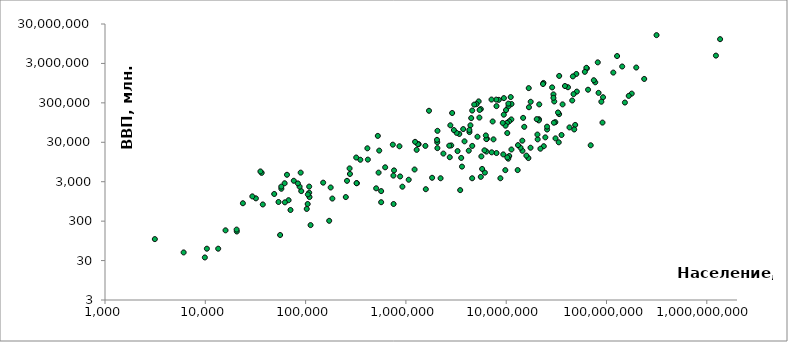
| Category | ВВП, млн. долл. |
|---|---|
| 1356990000.0 | 12380000 |
| 1232828000.0 | 4735000 |
| 315370000.0 | 15660000 |
| 237641326.0 | 1212000 |
| 197986000.0 | 2362000 |
| 178352000.0 | 514600 |
| 166629383.0 | 450500 |
| 152518015.0 | 305500 |
| 143369806.0 | 2509000 |
| 127487000.0 | 4617000 |
| 116901761.0 | 1758000 |
| 92337852.0 | 416700 |
| 91195675.0 | 94760 |
| 88840000.0 | 320500 |
| 83344000.0 | 537800 |
| 81843743.0 | 3194000 |
| 77242003.0 | 997400 |
| 74724269.0 | 1125000 |
| 69575394.0 | 25190 |
| 65479453.00000001 | 646100 |
| 63704091.0 | 2253000 |
| 62989551.0 | 2323000 |
| 60820696.0 | 1834000 |
| 50586757.0 | 578600 |
| 50004441.0 | 1622000 |
| 48724387.0 | 82720 |
| 47656367.0 | 63440 |
| 46963000.0 | 500000 |
| 46196276.0 | 1407000 |
| 45539121.0 | 344700 |
| 42749418.0 | 71500 |
| 41281631.0 | 746900 |
| 38538447.0 | 802000 |
| 36485828.0 | 274500 |
| 35620977.0 | 45900 |
| 33703068.0 | 155400 |
| 33749000.0 | 1446000 |
| 33397058.0 | 29990 |
| 32844000.0 | 171000 |
| 31011137.0 | 37740 |
| 30894000.0 | 97210 |
| 30135875.0 | 325400 |
| 29874600.0 | 94040 |
| 29577175.0 | 492000 |
| 29573000.0 | 402100 |
| 28705133.0 | 740500 |
| 25569263.0 | 63240 |
| 25545939.0 | 74770 |
| 24553672.0 | 40000 |
| 23700715.0 | 23870 |
| 23521000.0 | 960700 |
| 23282670.0 | 901900 |
| 21928518.0 | 20600 |
| 21355849.0 | 274100 |
| 21223550.0 | 115100 |
| 21117690.0 | 107600 |
| 20594615.0 | 35600 |
| 20468943.0 | 47120 |
| 20162517.0 | 115900 |
| 17546000.0 | 319400 |
| 17481984.0 | 21830 |
| 16856000.0 | 232300 |
| 16774750.000000002 | 709500 |
| 16644338.999999998 | 11930 |
| 15882815.0 | 13770 |
| 15137569.0 | 73950 |
| 14747000.0 | 124800 |
| 14517176.0 | 18260 |
| 14478320.0 | 32950 |
| 13883577.0 | 21930 |
| 13107945.0 | 25400 |
| 13013678.0 | 5916 |
| 11290067.0 | 280800 |
| 11274106.0 | 19690 |
| 11249266.0 | 114100 |
| 11094850.0 | 420600 |
| 10718379.0 | 13460 |
| 10673800.0 | 101700 |
| 10541840.0 | 245000 |
| 10505445.0 | 286700 |
| 10480710.0 | 11530 |
| 10255644.0 | 12440 |
| 10248042.0 | 51410 |
| 10183339.0 | 93230 |
| 9957731.0 | 196800 |
| 9846582.0 | 79090 |
| 9797445.0 | 5896 |
| 9482855.0 | 395800 |
| 9462400.0 | 150300 |
| 9351838.0 | 14790 |
| 9235100.0 | 93020 |
| 8749387.0 | 3672 |
| 8443018.0 | 357800 |
| 8000000.0 | 247900 |
| 8000000.0 | 16010 |
| 7954662.0 | 362400 |
| 7466000.0 | 35600 |
| 7327224.0 | 101200 |
| 7170112.0 | 16700 |
| 7136300.0 | 363700 |
| 6415100.0 | 36820 |
| 6348800.0 | 17440 |
| 6337127.0 | 36210 |
| 6264129.0 | 44780 |
| 6126450.0 | 5100 |
| 6071045.0 | 18770 |
| 5753324.0 | 6324 |
| 5654800.0 | 13160 |
| 5580862.0 | 3978 |
| 5580516.0 | 208500 |
| 5430800.0 | 198100 |
| 5404322.0 | 126900 |
| 5312400.0 | 326700 |
| 5169660.0 | 41510 |
| 5060500.0 | 278100 |
| 4800250.0 | 271200 |
| 4585000.0 | 24280 |
| 4582769.0 | 191500 |
| 4575586.0 | 3672 |
| 4478100.0 | 123300 |
| 4398150.0 | 80890 |
| 4301712.0 | 54470 |
| 4291719.0 | 61610 |
| 4233063.0 | 18360 |
| 3839737.0 | 31720 |
| 3725789.0 | 64840 |
| 3622961.0 | 7242 |
| 3559500.0 | 12040 |
| 3476608.0 | 1836 |
| 3405813.0 | 48760 |
| 3274300.0 | 17950 |
| 3203792.0 | 52020 |
| 3007758.0 | 61300 |
| 2891553.0 | 165900 |
| 2831741.0 | 24990 |
| 2773479.0 | 80890 |
| 2736800.0 | 12550 |
| 2705800.0 | 24580 |
| 2364433.0 | 15500 |
| 2216850.0 | 3672 |
| 2063840.0 | 58560 |
| 2059794.0000000002 | 21320 |
| 2053237.0000000002 | 30090 |
| 2041763.0 | 34580 |
| 1824777.0 | 3774 |
| 1699435.0 | 189000 |
| 1579632.0 | 1938 |
| 1563873.0 | 24280 |
| 1339662.0 | 26930 |
| 1317714.0 | 26830 |
| 1280294.0 | 19280 |
| 1234571.0 | 30800 |
| 1220408.0 | 6120 |
| 1066409.0 | 3366 |
| 922708.0 | 2244 |
| 875822.0 | 4080 |
| 862011.0 | 23770 |
| 761510.0 | 5814 |
| 753943.0 | 816 |
| 750443.0 | 4284 |
| 740471.0 | 26110 |
| 621240.0 | 6957 |
| 566613.0 | 906.5 |
| 566481.0 | 1734 |
| 542200.0 | 18470 |
| 534175.0 | 5100 |
| 524853.0 | 43550 |
| 505335.0 | 2040 |
| 417520.0 | 10910 |
| 412892.0 | 21110 |
| 351275.0 | 10810 |
| 324313.0 | 2754 |
| 322100.0 | 2754 |
| 319575.0 | 12330 |
| 276731.0 | 4718 |
| 274530.0 | 6528 |
| 258735.0 | 3158 |
| 251674.0 | 1224 |
| 184772.0 | 1122 |
| 177794.0 | 2142 |
| 171878.0 | 306 |
| 149679.0 | 2838 |
| 112098.0 | 238.1 |
| 109367.0 | 1224 |
| 108590.0 | 1577 |
| 108587.0 | 2258 |
| 105303.0 | 1428 |
| 104891.0 | 816 |
| 102660.0 | 612 |
| 90510.0 | 1734 |
| 89300.0 | 5100 |
| 87169.0 | 2244 |
| 83739.0 | 2719 |
| 76246.0 | 3169 |
| 70680.0 | 575.3 |
| 67665.0 | 1020 |
| 65208.0 | 4500 |
| 62152.0 | 900 |
| 61811.0 | 2742 |
| 57300.0 | 1989 |
| 57223.0 | 2250 |
| 55717.0 | 133.5 |
| 53697.0 | 918 |
| 48660.0 | 1465 |
| 37429.0 | 794.7 |
| 36475.0 | 5028 |
| 35444.0 | 5470 |
| 31945.0 | 1136 |
| 29441.0 | 1275 |
| 23705.0 | 853.4 |
| 20609.0 | 164 |
| 20528.0 | 183.2 |
| 15911.000000000002 | 175.4 |
| 13445.0 | 60 |
| 10370.0 | 60 |
| 9897.0 | 36 |
| 6082.0 | 48.3 |
| 3140.0 | 105.1 |